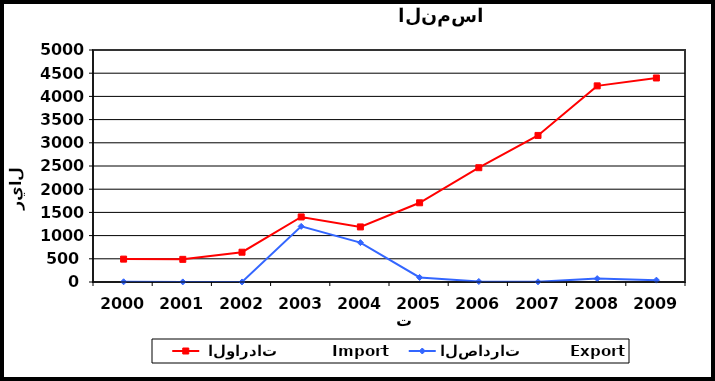
| Category |  الواردات           Import | الصادرات          Export |
|---|---|---|
| 2000.0 | 493 | 5 |
| 2001.0 | 488 | 2 |
| 2002.0 | 642 | 1 |
| 2003.0 | 1402 | 1199 |
| 2004.0 | 1187 | 849 |
| 2005.0 | 1707 | 98 |
| 2006.0 | 2463 | 11 |
| 2007.0 | 3159 | 4 |
| 2008.0 | 4227 | 73 |
| 2009.0 | 4397 | 40 |